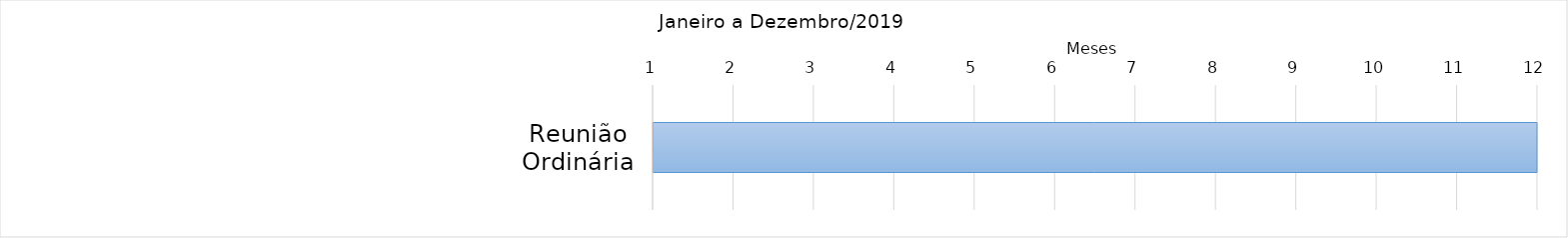
| Category | Início | Duração |
|---|---|---|
| Reunião Ordinária | 1 | 12 |